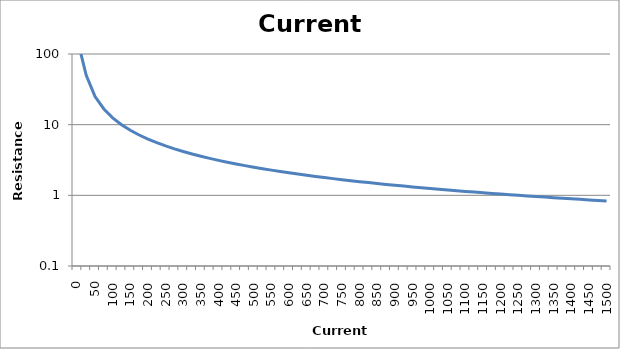
| Category | R1 Value (Ω) |
|---|---|
| 0.0 | 160 |
| 25.0 | 50 |
| 50.0 | 25 |
| 75.0 | 16.667 |
| 100.0 | 12.5 |
| 125.0 | 10 |
| 150.0 | 8.333 |
| 175.0 | 7.143 |
| 200.0 | 6.25 |
| 225.0 | 5.556 |
| 250.0 | 5 |
| 275.0 | 4.545 |
| 300.0 | 4.167 |
| 325.0 | 3.846 |
| 350.0 | 3.571 |
| 375.0 | 3.333 |
| 400.0 | 3.125 |
| 425.0 | 2.941 |
| 450.0 | 2.778 |
| 475.0 | 2.632 |
| 500.0 | 2.5 |
| 525.0 | 2.381 |
| 550.0 | 2.273 |
| 575.0 | 2.174 |
| 600.0 | 2.083 |
| 625.0 | 2 |
| 650.0 | 1.923 |
| 675.0 | 1.852 |
| 700.0 | 1.786 |
| 725.0 | 1.724 |
| 750.0 | 1.667 |
| 775.0 | 1.613 |
| 800.0 | 1.562 |
| 825.0 | 1.515 |
| 850.0 | 1.471 |
| 875.0 | 1.429 |
| 900.0 | 1.389 |
| 925.0 | 1.351 |
| 950.0 | 1.316 |
| 975.0 | 1.282 |
| 1000.0 | 1.25 |
| 1025.0 | 1.22 |
| 1050.0 | 1.19 |
| 1075.0 | 1.163 |
| 1100.0 | 1.136 |
| 1125.0 | 1.111 |
| 1150.0 | 1.087 |
| 1175.0 | 1.064 |
| 1200.0 | 1.042 |
| 1225.0 | 1.02 |
| 1250.0 | 1 |
| 1275.0 | 0.98 |
| 1300.0 | 0.962 |
| 1325.0 | 0.943 |
| 1350.0 | 0.926 |
| 1375.0 | 0.909 |
| 1400.0 | 0.893 |
| 1425.0 | 0.877 |
| 1450.0 | 0.862 |
| 1475.0 | 0.847 |
| 1500.0 | 0.833 |